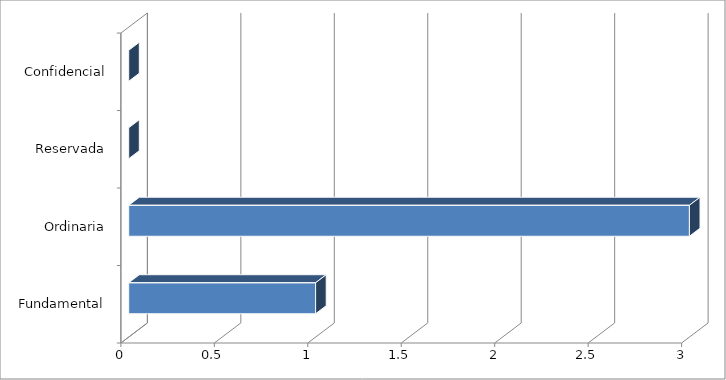
| Category | Series 0 |
|---|---|
| 0 | 1 |
| 1 | 3 |
| 2 | 0 |
| 3 | 0 |